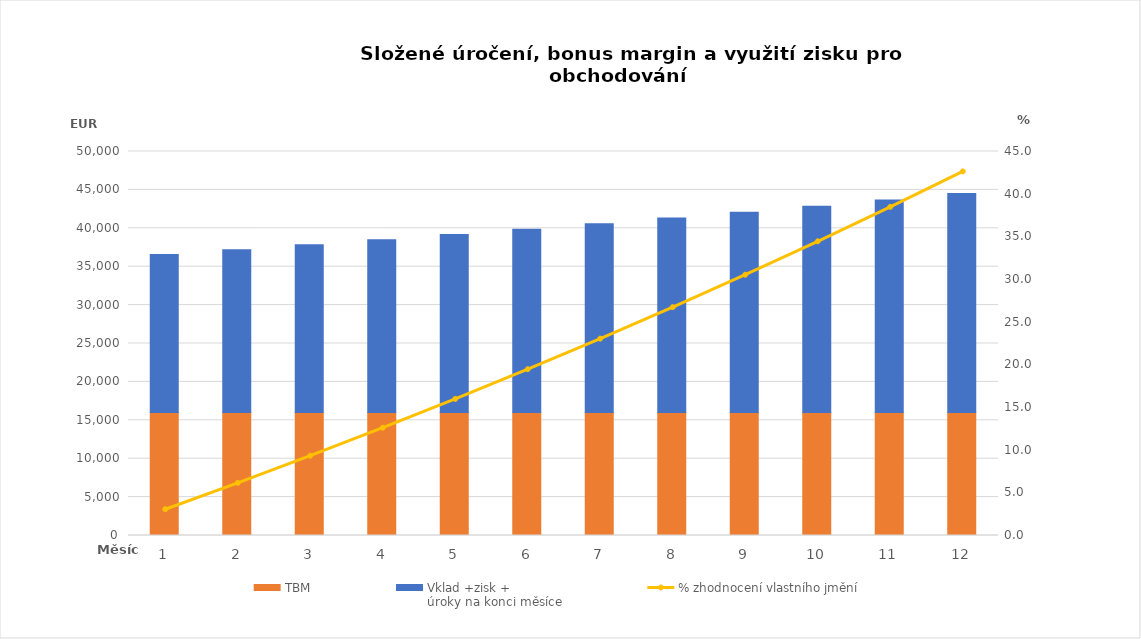
| Category | TBM | Vklad +zisk +
úroky na konci měsíce |
|---|---|---|
| 1.0 | 16000 | 20604 |
| 2.0 | 16000 | 21222.12 |
| 3.0 | 16000 | 21858.784 |
| 4.0 | 16000 | 22514.547 |
| 5.0 | 16000 | 23189.984 |
| 6.0 | 16000 | 23885.683 |
| 7.0 | 16000 | 24602.254 |
| 8.0 | 16000 | 25340.321 |
| 9.0 | 16000 | 26100.531 |
| 10.0 | 16000 | 26883.547 |
| 11.0 | 16000 | 27690.053 |
| 12.0 | 16000 | 28520.755 |